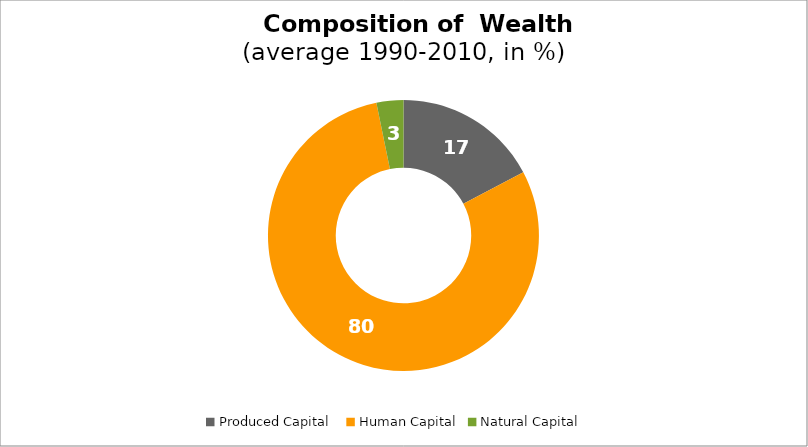
| Category | Series 0 |
|---|---|
| Produced Capital  | 17.257 |
| Human Capital | 79.532 |
| Natural Capital | 3.211 |